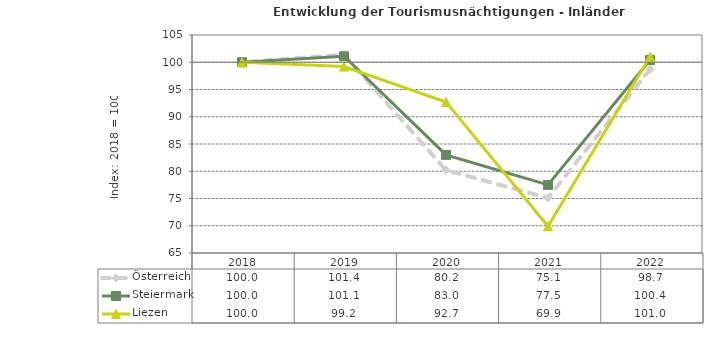
| Category | Österreich | Steiermark | Liezen |
|---|---|---|---|
| 2022.0 | 98.7 | 100.4 | 101 |
| 2021.0 | 75.1 | 77.5 | 69.9 |
| 2020.0 | 80.2 | 83 | 92.7 |
| 2019.0 | 101.4 | 101.1 | 99.2 |
| 2018.0 | 100 | 100 | 100 |